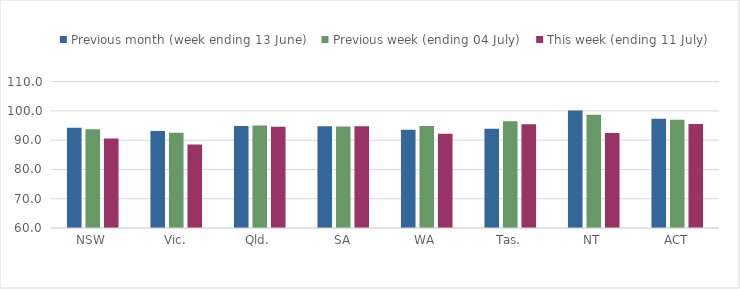
| Category | Previous month (week ending 13 June) | Previous week (ending 04 July) | This week (ending 11 July) |
|---|---|---|---|
| NSW | 94.287 | 93.711 | 90.546 |
| Vic. | 93.168 | 92.536 | 88.541 |
| Qld. | 94.806 | 95.003 | 94.565 |
| SA | 94.739 | 94.69 | 94.778 |
| WA | 93.556 | 94.854 | 92.224 |
| Tas. | 93.889 | 96.488 | 95.432 |
| NT | 100.171 | 98.719 | 92.418 |
| ACT | 97.325 | 96.982 | 95.517 |